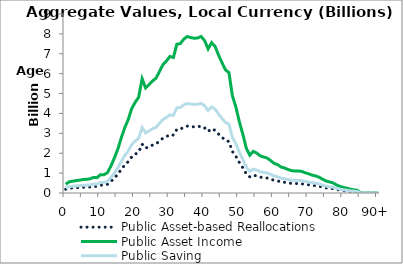
| Category | Public Asset-based Reallocations | Public Asset Income | Public Saving |
|---|---|---|---|
| 0 | 187.914 | 439.639 | 251.725 |
|  | 240.526 | 562.729 | 322.203 |
| 2 | 252.993 | 591.897 | 338.904 |
| 3 | 266.121 | 622.611 | 356.49 |
| 4 | 276.008 | 645.742 | 369.734 |
| 5 | 290.554 | 679.774 | 389.22 |
| 6 | 294.704 | 689.482 | 394.778 |
| 7 | 304.643 | 712.736 | 408.093 |
| 8 | 335.867 | 785.787 | 449.92 |
| 9 | 330.443 | 773.096 | 442.654 |
| 10 | 393.44 | 920.483 | 527.043 |
| 11 | 392.704 | 918.762 | 526.058 |
| 12 | 436.291 | 1020.737 | 584.446 |
| 13 | 578.063 | 1352.423 | 774.36 |
| 14 | 750.786 | 1756.522 | 1005.736 |
| 15 | 944.172 | 2208.965 | 1264.793 |
| 16 | 1185.965 | 2774.657 | 1588.692 |
| 17 | 1405.596 | 3288.502 | 1882.906 |
| 18 | 1579.342 | 3694.993 | 2115.651 |
| 19 | 1813.947 | 4243.87 | 2429.923 |
| 20 | 1948.896 | 4559.594 | 2610.698 |
| 21 | 2058.194 | 4815.305 | 2757.111 |
| 22 | 2454.33 | 5742.097 | 3287.767 |
| 23 | 2256.306 | 5278.805 | 3022.498 |
| 24 | 2330.292 | 5451.899 | 3121.607 |
| 25 | 2410.334 | 5639.164 | 3228.83 |
| 26 | 2466.728 | 5771.103 | 3304.375 |
| 27 | 2614.811 | 6117.553 | 3502.743 |
| 28 | 2758.719 | 6454.238 | 3695.519 |
| 29 | 2836.336 | 6635.829 | 3799.493 |
| 30 | 2935.111 | 6866.921 | 3931.81 |
| 31 | 2912.417 | 6813.827 | 3901.41 |
| 32 | 3196.527 | 7478.523 | 4281.997 |
| 33 | 3210.127 | 7510.342 | 4300.215 |
| 34 | 3307.222 | 7737.503 | 4430.281 |
| 35 | 3363.07 | 7868.164 | 4505.094 |
| 36 | 3340.466 | 7815.281 | 4474.815 |
| 37 | 3325.498 | 7780.262 | 4454.764 |
| 38 | 3331.831 | 7795.079 | 4463.248 |
| 39 | 3363.317 | 7868.742 | 4505.425 |
| 40 | 3273.271 | 7658.073 | 4384.802 |
| 41 | 3096.383 | 7244.23 | 4147.847 |
| 42 | 3231.112 | 7559.439 | 4328.327 |
| 43 | 3151.24 | 7372.572 | 4221.332 |
| 44 | 2965.828 | 6938.786 | 3972.958 |
| 45 | 2800.984 | 6553.12 | 3752.136 |
| 46 | 2647.398 | 6193.795 | 3546.396 |
| 47 | 2586.318 | 6050.893 | 3464.575 |
| 48 | 2086.799 | 4882.23 | 2795.431 |
| 49 | 1847.12 | 4321.482 | 2474.362 |
| 50 | 1529.511 | 3578.41 | 2048.899 |
| 51 | 1263.81 | 2956.782 | 1692.972 |
| 52 | 962.613 | 2252.109 | 1289.496 |
| 53 | 812.114 | 1900.005 | 1087.89 |
| 54 | 893.79 | 2091.092 | 1197.302 |
| 55 | 858.846 | 2009.338 | 1150.492 |
| 56 | 797.346 | 1865.453 | 1068.107 |
| 57 | 773.48 | 1809.616 | 1036.136 |
| 58 | 750.824 | 1756.611 | 1005.787 |
| 59 | 697.532 | 1631.93 | 934.398 |
| 60 | 636.989 | 1490.285 | 853.296 |
| 61 | 610.422 | 1428.13 | 817.708 |
| 62 | 558.557 | 1306.788 | 748.231 |
| 63 | 538.247 | 1259.271 | 721.024 |
| 64 | 505.879 | 1183.543 | 677.664 |
| 65 | 481.093 | 1125.555 | 644.462 |
| 66 | 473.123 | 1106.908 | 633.785 |
| 67 | 473.443 | 1107.656 | 634.214 |
| 68 | 463.347 | 1084.036 | 620.689 |
| 69 | 434.094 | 1015.597 | 581.503 |
| 70 | 411.073 | 961.736 | 550.664 |
| 71 | 382.892 | 895.807 | 512.914 |
| 72 | 365.981 | 856.24 | 490.26 |
| 73 | 337.477 | 789.554 | 452.077 |
| 74 | 295.046 | 690.282 | 395.237 |
| 75 | 256.391 | 599.847 | 343.456 |
| 76 | 238.01 | 556.843 | 318.833 |
| 77 | 214.841 | 502.637 | 287.796 |
| 78 | 172.815 | 404.314 | 231.499 |
| 79 | 141.544 | 331.153 | 189.609 |
| 80 | 118.746 | 277.817 | 159.07 |
| 81 | 103.156 | 241.341 | 138.185 |
| 82 | 80.515 | 188.372 | 107.857 |
| 83 | 68.197 | 159.551 | 91.355 |
| 84 | 57.919 | 135.506 | 77.587 |
| 85 | 0 | 0 | 0 |
| 86 | 0 | 0 | 0 |
| 87 | 0 | 0 | 0 |
| 88 | 0 | 0 | 0 |
| 89 | 0 | 0 | 0 |
| 90+ | 0 | 0 | 0 |